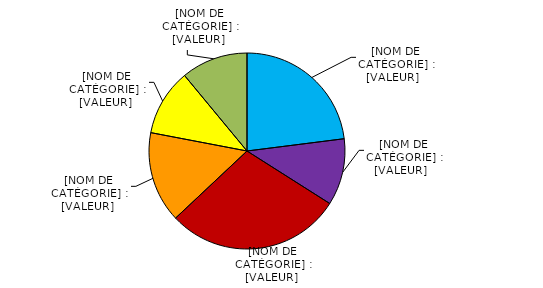
| Category | Series 0 |
|---|---|
| Restauration | 0.23 |
| Logement | 0.11 |
| Familles, vacances  | 0.29 |
| Mutuelles, associations | 0.15 |
| Prévention et secours | 0.11 |
| Autre | 0.11 |